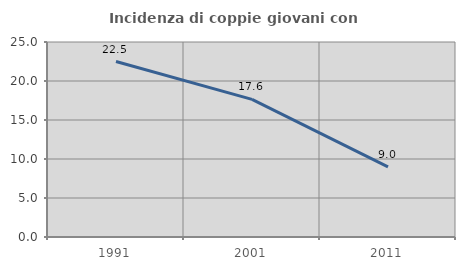
| Category | Incidenza di coppie giovani con figli |
|---|---|
| 1991.0 | 22.493 |
| 2001.0 | 17.647 |
| 2011.0 | 9 |